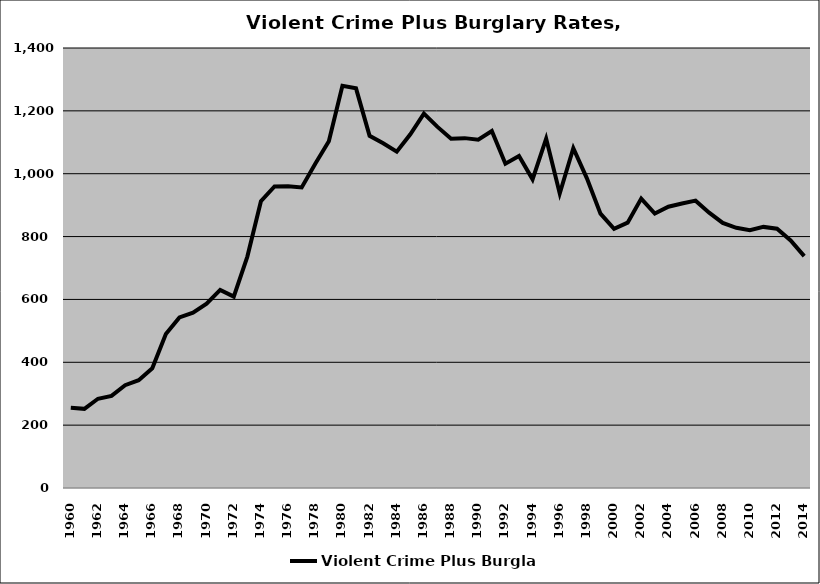
| Category | Violent Crime Plus Burglary |
|---|---|
| 1960.0 | 254.974 |
| 1961.0 | 251.853 |
| 1962.0 | 283.94 |
| 1963.0 | 292.986 |
| 1964.0 | 326.959 |
| 1965.0 | 342.935 |
| 1966.0 | 380.743 |
| 1967.0 | 489.975 |
| 1968.0 | 542.54 |
| 1969.0 | 558.109 |
| 1970.0 | 586.611 |
| 1971.0 | 630.505 |
| 1972.0 | 608.949 |
| 1973.0 | 736.295 |
| 1974.0 | 912.504 |
| 1975.0 | 959.268 |
| 1976.0 | 959.93 |
| 1977.0 | 956.478 |
| 1978.0 | 1032.044 |
| 1979.0 | 1103.238 |
| 1980.0 | 1279.866 |
| 1981.0 | 1271.66 |
| 1982.0 | 1120.585 |
| 1983.0 | 1096.764 |
| 1984.0 | 1070.034 |
| 1985.0 | 1125.347 |
| 1986.0 | 1191.091 |
| 1987.0 | 1149.012 |
| 1988.0 | 1111.15 |
| 1989.0 | 1113.204 |
| 1990.0 | 1108.092 |
| 1991.0 | 1135.742 |
| 1992.0 | 1031.757 |
| 1993.0 | 1056.183 |
| 1994.0 | 982.185 |
| 1995.0 | 1111.823 |
| 1996.0 | 937.062 |
| 1997.0 | 1081.487 |
| 1998.0 | 985.255 |
| 1999.0 | 872.861 |
| 2000.0 | 824.857 |
| 2001.0 | 844.143 |
| 2002.0 | 920.725 |
| 2003.0 | 873.223 |
| 2004.0 | 894.95 |
| 2005.0 | 905.203 |
| 2006.0 | 914.36 |
| 2007.0 | 876.191 |
| 2008.0 | 843.324 |
| 2009.0 | 827.965 |
| 2010.0 | 820.292 |
| 2011.0 | 830.783 |
| 2012.0 | 824.965 |
| 2013.0 | 787.785 |
| 2014.0 | 737.82 |